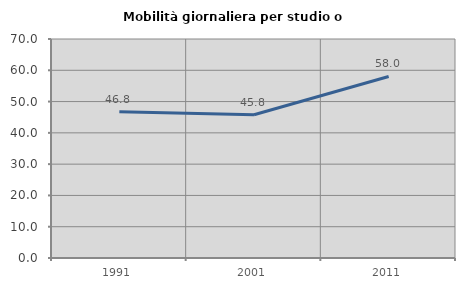
| Category | Mobilità giornaliera per studio o lavoro |
|---|---|
| 1991.0 | 46.785 |
| 2001.0 | 45.771 |
| 2011.0 | 58.031 |